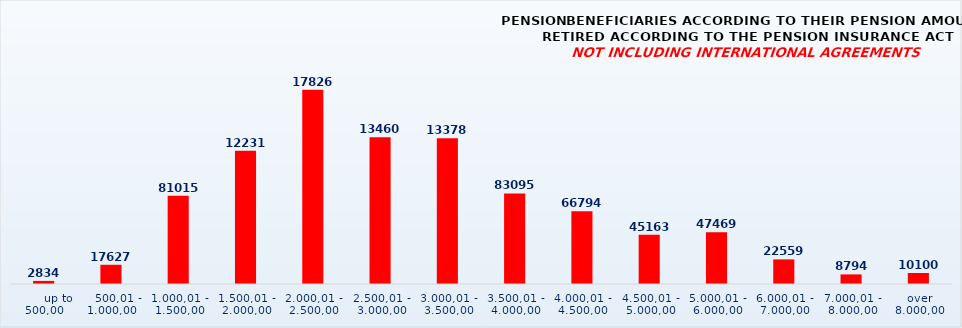
| Category | PENSION BENEFICIARIES ACCORDING TO TYPES AND AMOUNTS OF PENSION, RETIRED ACCORDING TO THE PENSION INSURANCE ACT
NOT INCLUDING INTERNATIONAL AGREEMENTS |
|---|---|
|       up to 500,00 | 2834 |
|    500,01 - 1.000,00 | 17627 |
| 1.000,01 - 1.500,00 | 81015 |
| 1.500,01 - 2.000,00 | 122318 |
| 2.000,01 - 2.500,00 | 178268 |
| 2.500,01 - 3.000,00 | 134600 |
| 3.000,01 - 3.500,00 | 133782 |
| 3.500,01 - 4.000,00 | 83095 |
| 4.000,01 - 4.500,00 | 66794 |
| 4.500,01 - 5.000,00 | 45163 |
| 5.000,01 - 6.000,00 | 47469 |
| 6.000,01 - 7.000,00 | 22559 |
| 7.000,01 - 8.000,00 | 8794 |
|  over  8.000,00 | 10100 |